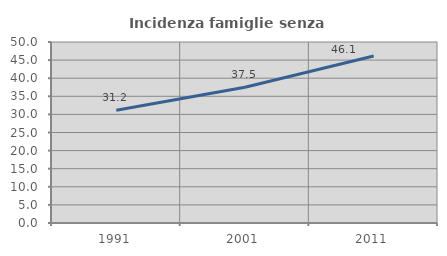
| Category | Incidenza famiglie senza nuclei |
|---|---|
| 1991.0 | 31.174 |
| 2001.0 | 37.516 |
| 2011.0 | 46.126 |